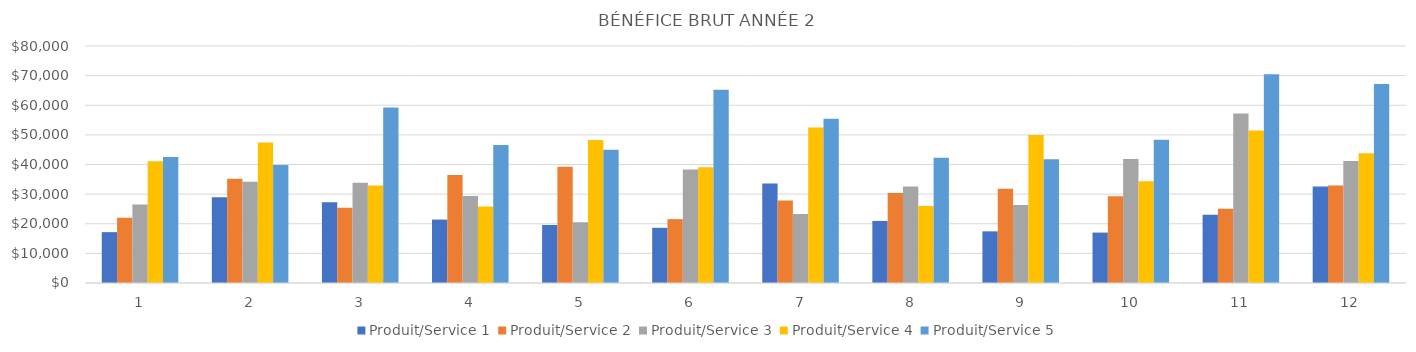
| Category | Produit/Service 1 | Produit/Service 2 | Produit/Service 3 | Produit/Service 4 | Produit/Service 5 |
|---|---|---|---|---|---|
| 0 | 17167.8 | 21992.6 | 26467 | 41126.4 | 42546 |
| 1 | 28975.1 | 35202.65 | 34178.4 | 47385.9 | 39830 |
| 2 | 27264 | 25397.75 | 33852 | 32945 | 59276 |
| 3 | 21413.6 | 36433.8 | 29356.6 | 25861.5 | 46578 |
| 4 | 19574.7 | 39261.6 | 20536 | 48289.5 | 45010 |
| 5 | 18637.5 | 21563.4 | 38322 | 39049.5 | 65212 |
| 6 | 33575.9 | 27828.85 | 23328 | 52448 | 55468 |
| 7 | 20959.2 | 30360 | 32580 | 26026 | 42238 |
| 8 | 17437.6 | 31848 | 26289 | 49962 | 41748 |
| 9 | 17017 | 29310.05 | 41841 | 34386 | 48356 |
| 10 | 23032.1 | 25074.75 | 57220.9 | 51454 | 70490 |
| 11 | 32578 | 32910 | 41140 | 43836 | 67192 |